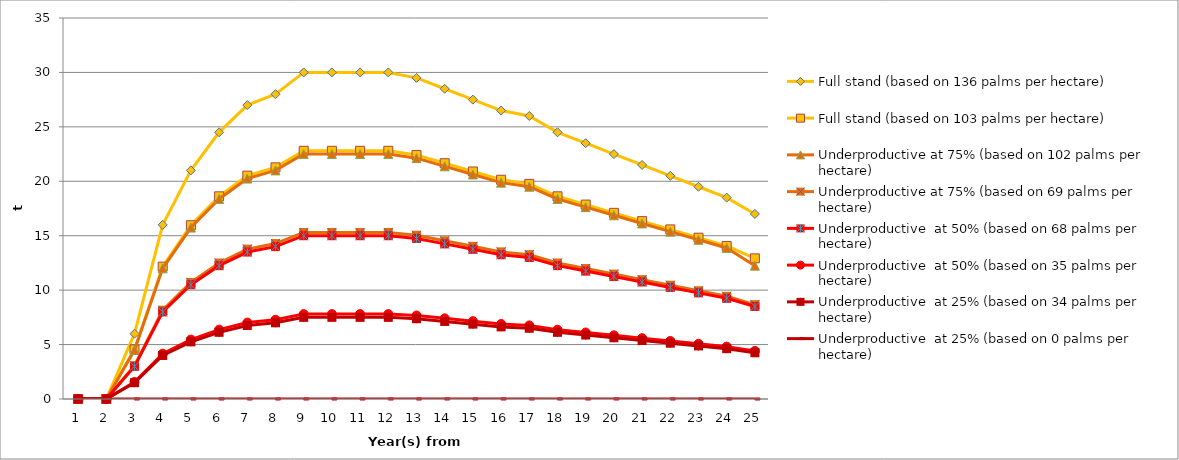
| Category | Full stand (based on 136 palms per hectare) | Full stand (based on 103 palms per hectare) | Underproductive at 75% (based on 102 palms per hectare) | Underproductive at 75% (based on 69 palms per hectare) | Underproductive  at 50% (based on 68 palms per hectare) | Underproductive  at 50% (based on 35 palms per hectare) | Underproductive  at 25% (based on 34 palms per hectare) | Underproductive  at 25% (based on 0 palms per hectare) |
|---|---|---|---|---|---|---|---|---|
| 0 | 0 | 0 | 0 | 0 | 0 | 0 | 0 | 0 |
| 1 | 0 | 0 | 0 | 0 | 0 | 0 | 0 | 0 |
| 2 | 6 | 4.56 | 4.5 | 3.06 | 3 | 1.56 | 1.5 | 0 |
| 3 | 16 | 12.16 | 12 | 8.16 | 8 | 4.16 | 4 | 0 |
| 4 | 21 | 15.96 | 15.75 | 10.71 | 10.5 | 5.46 | 5.25 | 0 |
| 5 | 24.5 | 18.62 | 18.375 | 12.495 | 12.25 | 6.37 | 6.125 | 0 |
| 6 | 27 | 20.52 | 20.25 | 13.77 | 13.5 | 7.02 | 6.75 | 0 |
| 7 | 28 | 21.28 | 21 | 14.28 | 14 | 7.28 | 7 | 0 |
| 8 | 30 | 22.8 | 22.5 | 15.3 | 15 | 7.8 | 7.5 | 0 |
| 9 | 30 | 22.8 | 22.5 | 15.3 | 15 | 7.8 | 7.5 | 0 |
| 10 | 30 | 22.8 | 22.5 | 15.3 | 15 | 7.8 | 7.5 | 0 |
| 11 | 30 | 22.8 | 22.5 | 15.3 | 15 | 7.8 | 7.5 | 0 |
| 12 | 29.5 | 22.42 | 22.125 | 15.045 | 14.75 | 7.67 | 7.375 | 0 |
| 13 | 28.5 | 21.66 | 21.375 | 14.535 | 14.25 | 7.41 | 7.125 | 0 |
| 14 | 27.5 | 20.9 | 20.625 | 14.025 | 13.75 | 7.15 | 6.875 | 0 |
| 15 | 26.5 | 20.14 | 19.875 | 13.515 | 13.25 | 6.89 | 6.625 | 0 |
| 16 | 26 | 19.76 | 19.5 | 13.26 | 13 | 6.76 | 6.5 | 0 |
| 17 | 24.5 | 18.62 | 18.375 | 12.495 | 12.25 | 6.37 | 6.125 | 0 |
| 18 | 23.5 | 17.86 | 17.625 | 11.985 | 11.75 | 6.11 | 5.875 | 0 |
| 19 | 22.5 | 17.1 | 16.875 | 11.475 | 11.25 | 5.85 | 5.625 | 0 |
| 20 | 21.5 | 16.34 | 16.125 | 10.965 | 10.75 | 5.59 | 5.375 | 0 |
| 21 | 20.5 | 15.58 | 15.375 | 10.455 | 10.25 | 5.33 | 5.125 | 0 |
| 22 | 19.5 | 14.82 | 14.625 | 9.945 | 9.75 | 5.07 | 4.875 | 0 |
| 23 | 18.5 | 14.06 | 13.875 | 9.435 | 9.25 | 4.81 | 4.625 | 0 |
| 24 | 17 | 12.92 | 12.25 | 8.67 | 8.5 | 4.42 | 4.25 | 0 |